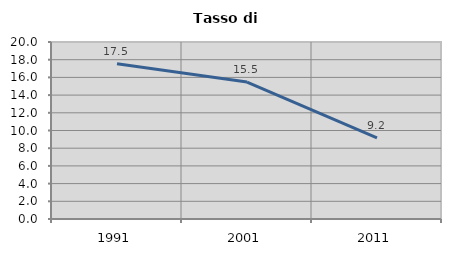
| Category | Tasso di disoccupazione   |
|---|---|
| 1991.0 | 17.538 |
| 2001.0 | 15.474 |
| 2011.0 | 9.158 |